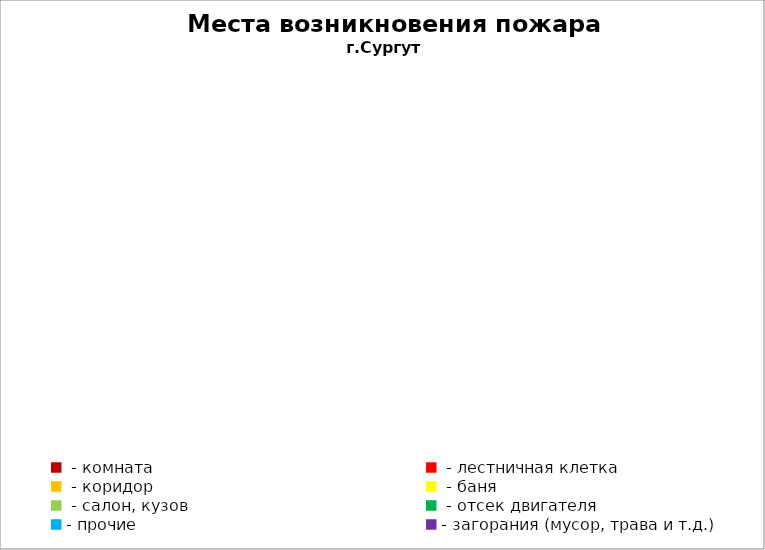
| Category | Места возникновения пожара |
|---|---|
|  - комната | 20 |
|  - лестничная клетка | 2 |
|  - коридор | 6 |
|  - баня | 11 |
|  - салон, кузов | 0 |
|  - отсек двигателя | 24 |
| - прочие | 29 |
| - загорания (мусор, трава и т.д.)  | 30 |